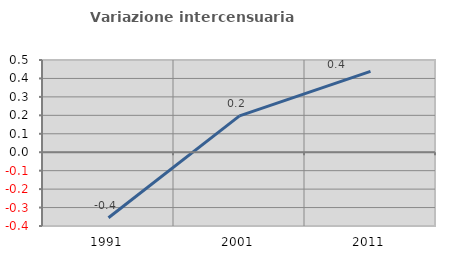
| Category | Variazione intercensuaria annua |
|---|---|
| 1991.0 | -0.355 |
| 2001.0 | 0.197 |
| 2011.0 | 0.438 |